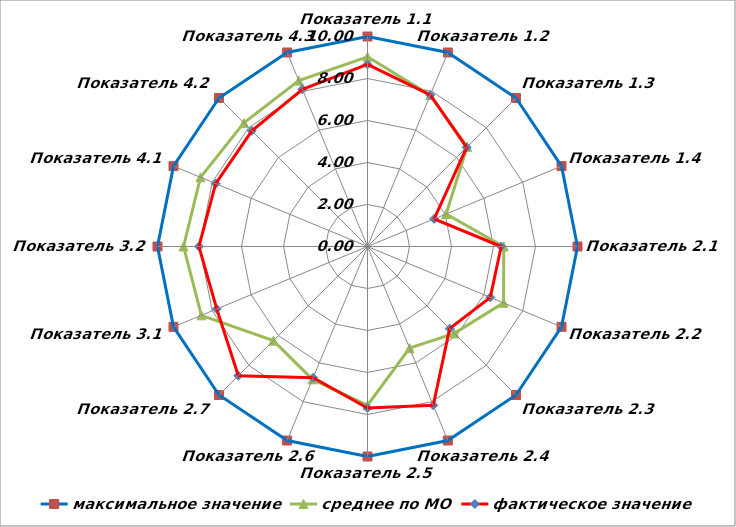
| Category | максимальное значение | среднее по МО | фактическое значение |
|---|---|---|---|
| Показатель 1.1 | 10 | 9.033 | 8.668 |
| Показатель 1.2 | 10 | 7.803 | 7.808 |
| Показатель 1.3 | 10 | 6.713 | 6.676 |
| Показатель 1.4 | 10 | 4.051 | 3.435 |
| Показатель 2.1 | 10 | 6.489 | 6.365 |
| Показатель 2.2 | 10 | 7.011 | 6.329 |
| Показатель 2.3 | 10 | 5.851 | 5.531 |
| Показатель 2.4 | 10 | 5.239 | 8.184 |
| Показатель 2.5 | 10 | 7.56 | 7.688 |
| Показатель 2.6 | 10 | 6.849 | 6.76 |
| Показатель 2.7 | 10 | 6.342 | 8.699 |
| Показатель 3.1 | 10 | 8.563 | 7.77 |
| Показатель 3.2 | 10 | 8.76 | 8.03 |
| Показатель 4.1 | 10 | 8.608 | 7.825 |
| Показатель 4.2 | 10 | 8.323 | 7.788 |
| Показатель 4.3 | 10 | 8.551 | 8.104 |